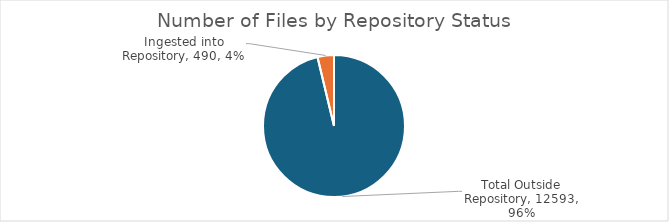
| Category | Number of Files |
|---|---|
| Total Outside Repository | 12593 |
| Ingested into Repository | 490 |